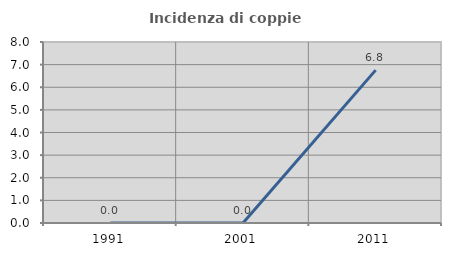
| Category | Incidenza di coppie miste |
|---|---|
| 1991.0 | 0 |
| 2001.0 | 0 |
| 2011.0 | 6.757 |